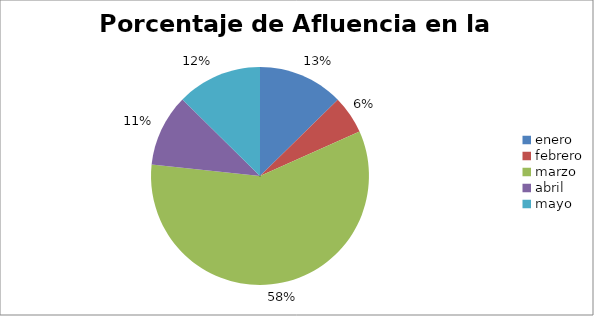
| Category | Series 0 |
|---|---|
| enero  | 2530 |
| febrero | 1136 |
| marzo | 11671 |
| abril | 2148 |
| mayo | 2520 |